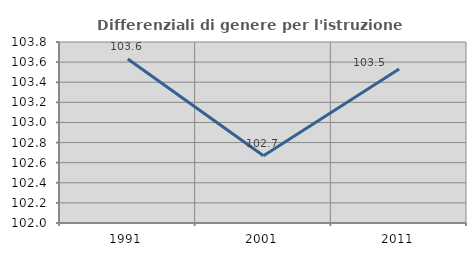
| Category | Differenziali di genere per l'istruzione superiore |
|---|---|
| 1991.0 | 103.632 |
| 2001.0 | 102.669 |
| 2011.0 | 103.531 |